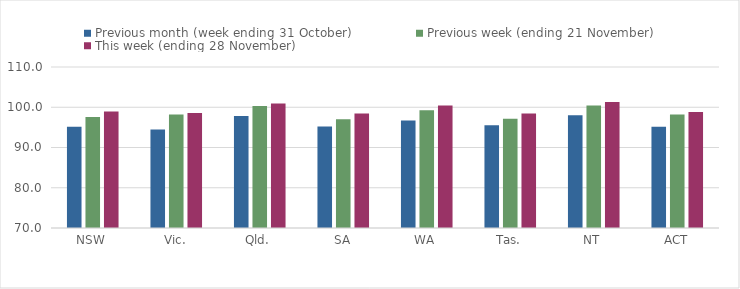
| Category | Previous month (week ending 31 October) | Previous week (ending 21 November) | This week (ending 28 November) |
|---|---|---|---|
| NSW | 95.17 | 97.57 | 98.97 |
| Vic. | 94.48 | 98.19 | 98.58 |
| Qld. | 97.84 | 100.3 | 100.95 |
| SA | 95.19 | 97.02 | 98.47 |
| WA | 96.72 | 99.28 | 100.44 |
| Tas. | 95.55 | 97.12 | 98.45 |
| NT | 97.99 | 100.44 | 101.33 |
| ACT | 95.18 | 98.17 | 98.8 |